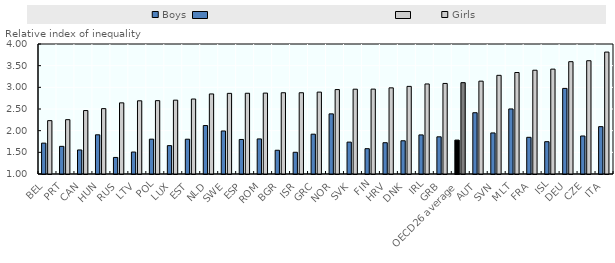
| Category | Boys | Girls |
|---|---|---|
| BEL | 1.712 | 2.232 |
| PRT | 1.638 | 2.254 |
| CAN | 1.555 | 2.464 |
| HUN | 1.905 | 2.509 |
| RUS | 1.382 | 2.642 |
| LTV | 1.507 | 2.689 |
| POL | 1.804 | 2.693 |
| LUX | 1.655 | 2.704 |
| EST | 1.803 | 2.73 |
| NLD | 2.118 | 2.847 |
| SWE | 1.993 | 2.861 |
| ESP | 1.797 | 2.863 |
| ROM | 1.809 | 2.867 |
| BGR | 1.548 | 2.875 |
| ISR | 1.501 | 2.875 |
| GRC | 1.919 | 2.89 |
| NOR | 2.388 | 2.948 |
| SVK | 1.736 | 2.957 |
| FIN | 1.584 | 2.959 |
| HRV | 1.722 | 2.988 |
| DNK | 1.767 | 3.022 |
| IRL | 1.902 | 3.078 |
| GRB | 1.858 | 3.09 |
| OECD26 average | 1.783 | 3.108 |
| AUT | 2.414 | 3.143 |
| SVN | 1.947 | 3.277 |
| MLT | 2.501 | 3.342 |
| FRA | 1.846 | 3.395 |
| ISL | 1.746 | 3.42 |
| DEU | 2.976 | 3.592 |
| CZE | 1.877 | 3.614 |
| ITA | 2.093 | 3.813 |